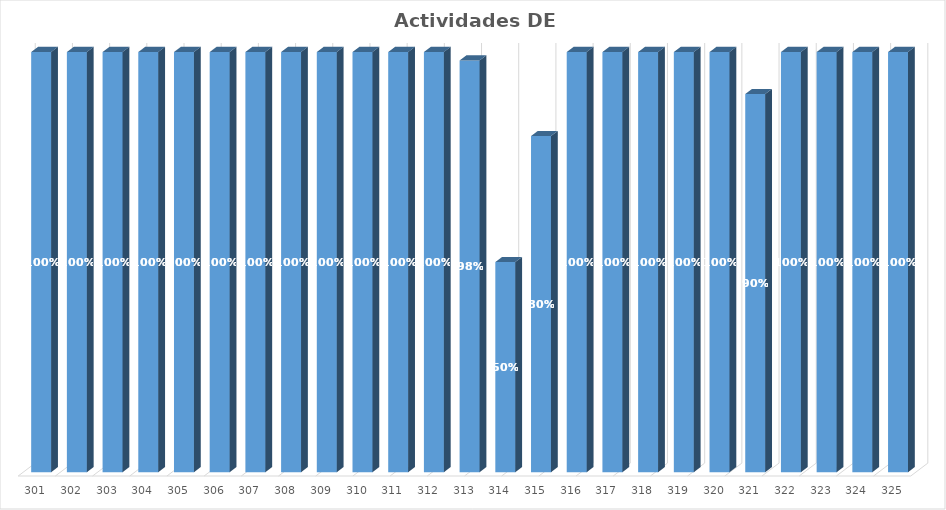
| Category | % Avance |
|---|---|
| 301.0 | 1 |
| 302.0 | 1 |
| 303.0 | 1 |
| 304.0 | 1 |
| 305.0 | 1 |
| 306.0 | 1 |
| 307.0 | 1 |
| 308.0 | 1 |
| 309.0 | 1 |
| 310.0 | 1 |
| 311.0 | 1 |
| 312.0 | 1 |
| 313.0 | 0.98 |
| 314.0 | 0.5 |
| 315.0 | 0.8 |
| 316.0 | 1 |
| 317.0 | 1 |
| 318.0 | 1 |
| 319.0 | 1 |
| 320.0 | 1 |
| 321.0 | 0.9 |
| 322.0 | 1 |
| 323.0 | 1 |
| 324.0 | 1 |
| 325.0 | 1 |